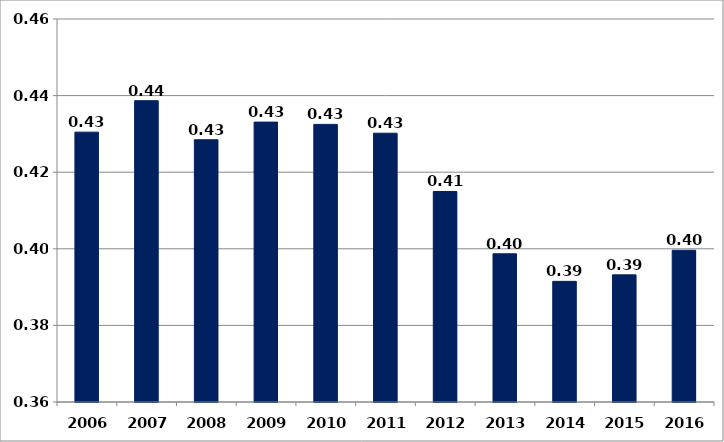
| Category | მთლიანი შემოსავლების მიხედვით1 |
|---|---|
| 2006.0 | 0.43 |
| 2007.0 | 0.439 |
| 2008.0 | 0.428 |
| 2009.0 | 0.433 |
| 2010.0 | 0.432 |
| 2011.0 | 0.43 |
| 2012.0 | 0.415 |
| 2013.0 | 0.399 |
| 2014.0 | 0.392 |
| 2015.0 | 0.393 |
| 2016.0 | 0.4 |